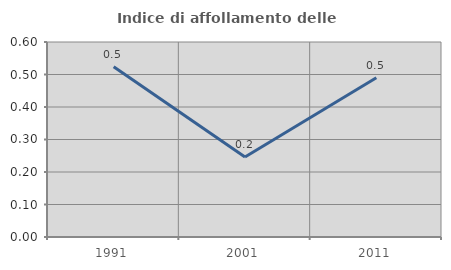
| Category | Indice di affollamento delle abitazioni  |
|---|---|
| 1991.0 | 0.524 |
| 2001.0 | 0.246 |
| 2011.0 | 0.49 |